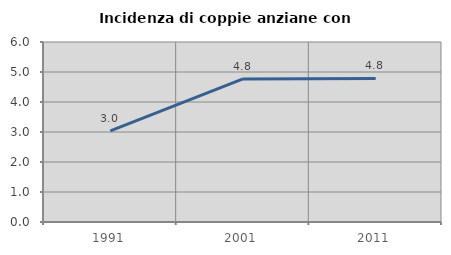
| Category | Incidenza di coppie anziane con figli |
|---|---|
| 1991.0 | 3.035 |
| 2001.0 | 4.769 |
| 2011.0 | 4.787 |